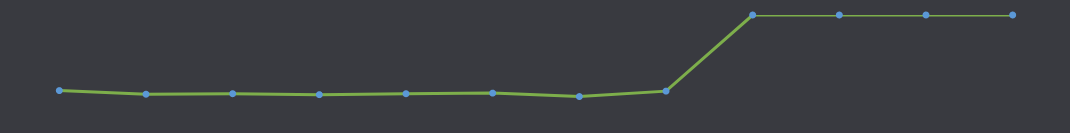
| Category | Доступные наличные деньги |
|---|---|
| ЯНВАРЬ | -36696 |
| ФЕВРАЛЬ | -38458 |
| МАРТ | -38211 |
| АПРЕЛЬ | -38672 |
| МАЙ | -38214.5 |
| ИЮНЬ | -37922 |
| ИЮЛЬ | -39589 |
| АВГУСТ | -36967 |
| СЕНТЯБРЬ | 0 |
| ОКТЯБРЬ | 0 |
| НОЯБРЬ | 0 |
| ДЕКАБРЬ | 0 |